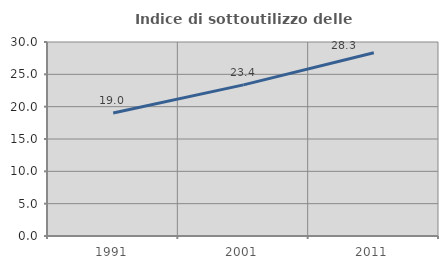
| Category | Indice di sottoutilizzo delle abitazioni  |
|---|---|
| 1991.0 | 19.033 |
| 2001.0 | 23.37 |
| 2011.0 | 28.348 |